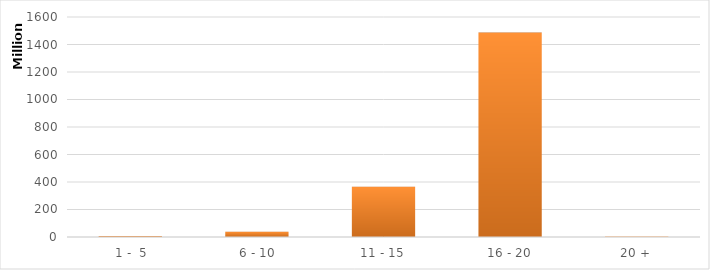
| Category | Series 0 |
|---|---|
|  1 -  5 | 7987543.28 |
|  6 - 10 | 38374231.61 |
| 11 - 15 | 365578680.63 |
| 16 - 20 | 1487216128.83 |
| 20 + | 3883152.06 |